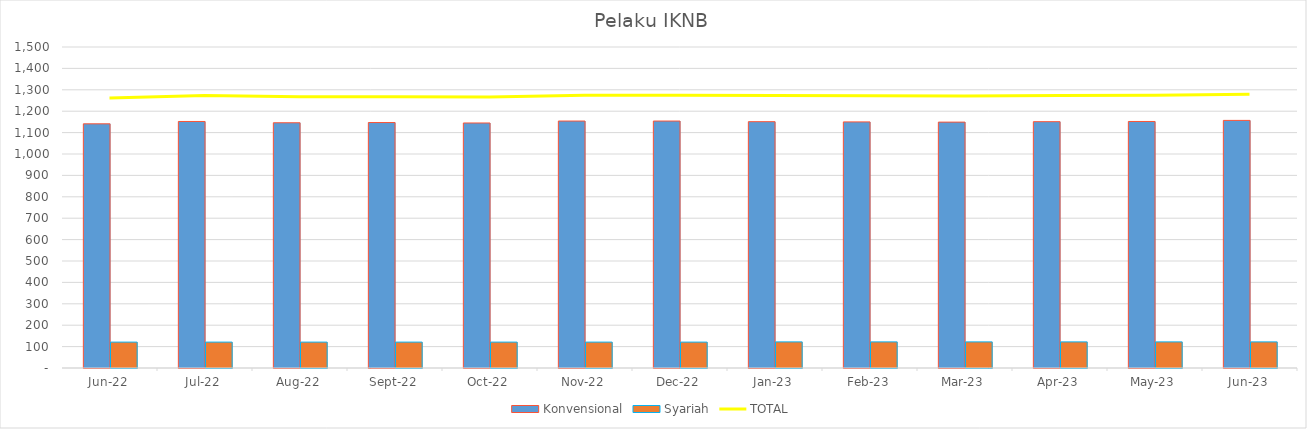
| Category |  Konvensional  |  Syariah  |
|---|---|---|
| 2022-06-01 | 1141 | 121 |
| 2022-07-01 | 1152 | 121 |
| 2022-08-01 | 1146 | 121 |
| 2022-09-01 | 1147 | 121 |
| 2022-10-01 | 1145 | 121 |
| 2022-11-01 | 1154 | 121 |
| 2022-12-01 | 1154 | 121 |
| 2023-01-01 | 1151 | 122 |
| 2023-02-01 | 1150 | 122 |
| 2023-03-01 | 1149 | 122 |
| 2023-04-01 | 1151 | 122 |
| 2023-05-01 | 1152 | 122 |
| 2023-06-01 | 1157 | 122 |